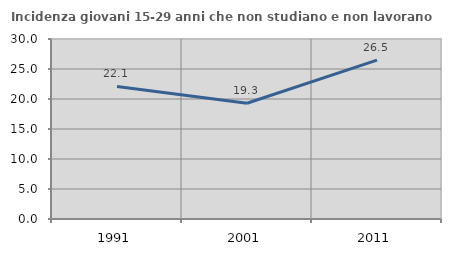
| Category | Incidenza giovani 15-29 anni che non studiano e non lavorano  |
|---|---|
| 1991.0 | 22.093 |
| 2001.0 | 19.298 |
| 2011.0 | 26.471 |